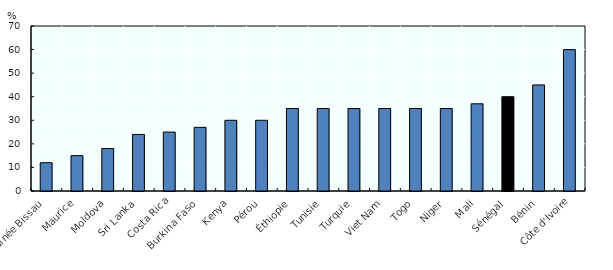
| Category | Taux IR maximum |
|---|---|
| Guinée Bissau | 12 |
| Maurice | 15 |
| Moldova | 18 |
| Sri Lanka | 24 |
| Costa Rica | 25 |
| Burkina Faso | 27 |
| Kenya | 30 |
| Pérou | 30 |
| Éthiopie | 35 |
| Tunisie | 35 |
| Turquie | 35 |
| Viet Nam | 35 |
| Togo | 35 |
| Niger | 35 |
| Mali | 37 |
| Sénégal | 40 |
| Bénin | 45 |
| Côte d'Ivoire | 60 |